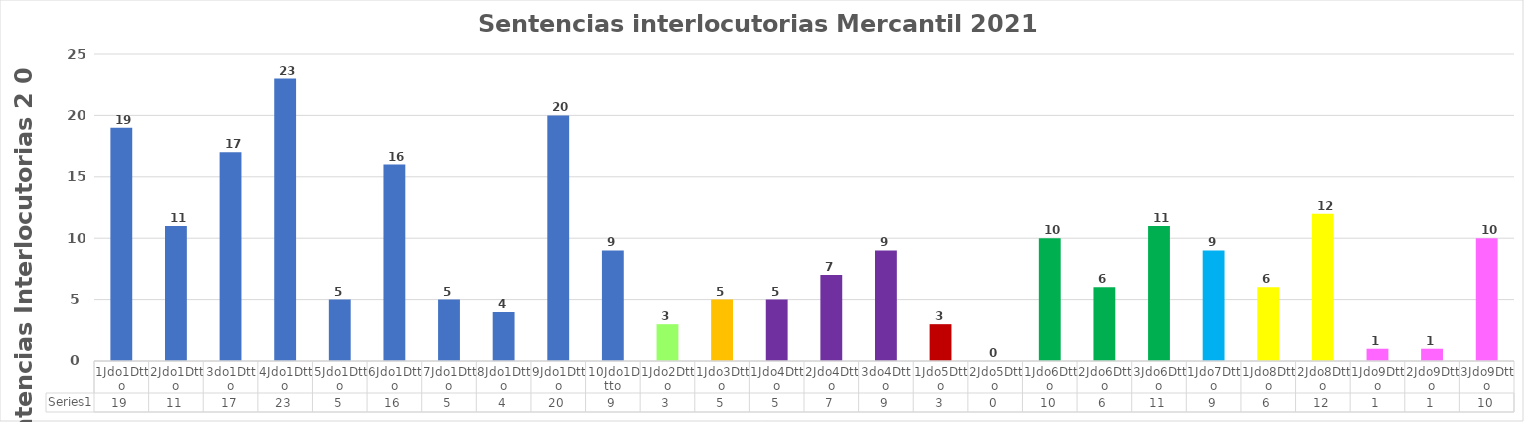
| Category | Series 0 |
|---|---|
| 1Jdo1Dtto | 19 |
| 2Jdo1Dtto | 11 |
| 3do1Dtto | 17 |
| 4Jdo1Dtto | 23 |
| 5Jdo1Dtto | 5 |
| 6Jdo1Dtto | 16 |
| 7Jdo1Dtto | 5 |
| 8Jdo1Dtto | 4 |
| 9Jdo1Dtto | 20 |
| 10Jdo1Dtto | 9 |
| 1Jdo2Dtto | 3 |
| 1Jdo3Dtto | 5 |
| 1Jdo4Dtto | 5 |
| 2Jdo4Dtto | 7 |
| 3do4Dtto | 9 |
| 1Jdo5Dtto | 3 |
| 2Jdo5Dtto | 0 |
| 1Jdo6Dtto | 10 |
| 2Jdo6Dtto | 6 |
| 3Jdo6Dtto | 11 |
| 1Jdo7Dtto | 9 |
| 1Jdo8Dtto | 6 |
| 2Jdo8Dtto | 12 |
| 1Jdo9Dtto | 1 |
| 2Jdo9Dtto | 1 |
| 3Jdo9Dtto | 10 |